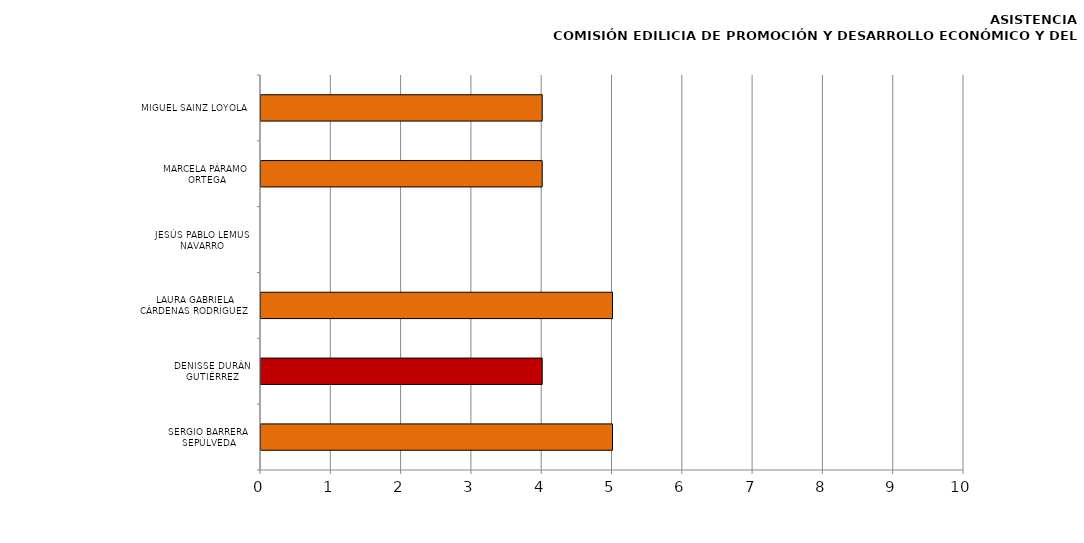
| Category | Series 0 |
|---|---|
| SERGIO BARRERA SEPÚLVEDA | 5 |
| DENISSE DURÁN GUTIÉRREZ | 4 |
| LAURA GABRIELA CÁRDENAS RODRÍGUEZ | 5 |
| JESÚS PABLO LEMUS NAVARRO | 0 |
| MARCELA PÁRAMO ORTEGA | 4 |
| MIGUEL SAINZ LOYOLA | 4 |